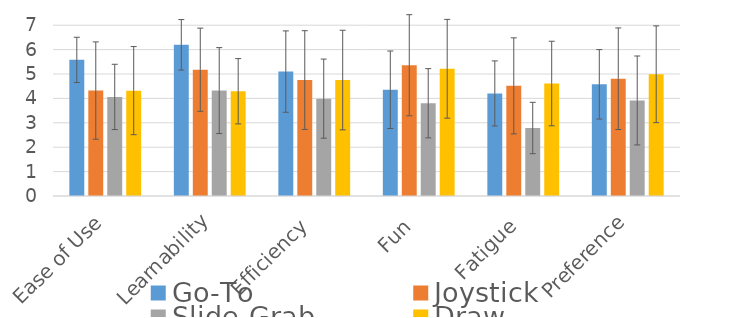
| Category | Go-To | Joystick | Slide-Grab | Draw |
|---|---|---|---|---|
| Ease of Use | 5.579 | 4.322 | 4.061 | 4.318 |
| Learnability | 6.196 | 5.176 | 4.32 | 4.293 |
| Efficiency | 5.099 | 4.751 | 3.989 | 4.752 |
| Fun | 4.355 | 5.359 | 3.801 | 5.214 |
| Fatigue | 4.203 | 4.514 | 2.786 | 4.61 |
| Preference | 4.577 | 4.806 | 3.915 | 4.989 |